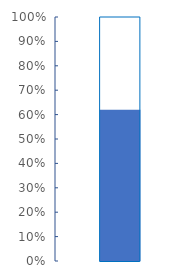
| Category | Actual |
|---|---|
| 0 | 0.62 |